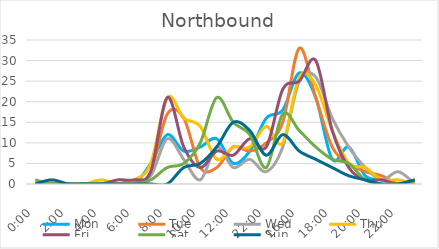
| Category | Mon | Tue | Wed | Thu | Fri | Sat | Sun |
|---|---|---|---|---|---|---|---|
| 0.0 | 0 | 0 | 0 | 0 | 0 | 1 | 0 |
| 0.041667 | 0 | 0 | 0 | 1 | 0 | 0 | 1 |
| 0.083333 | 0 | 0 | 0 | 0 | 0 | 0 | 0 |
| 0.125 | 0 | 0 | 0 | 0 | 0 | 0 | 0 |
| 0.166667 | 0 | 0 | 0 | 1 | 0 | 0 | 0 |
| 0.208333 | 0 | 0 | 0 | 0 | 1 | 0 | 0 |
| 0.25 | 0 | 0 | 1 | 1 | 1 | 0 | 0 |
| 0.291667 | 5 | 3 | 2 | 5 | 3 | 1 | 0 |
| 0.333333 | 12 | 17 | 11 | 21 | 21 | 4 | 0 |
| 0.375 | 8 | 16 | 6 | 16 | 9 | 5 | 4 |
| 0.416667 | 9 | 4 | 1 | 14 | 4 | 10 | 5 |
| 0.458333 | 11 | 4 | 9 | 6 | 8 | 21 | 9 |
| 0.5 | 5 | 9 | 4 | 9 | 7 | 15 | 15 |
| 0.541667 | 8 | 8 | 6 | 9 | 11 | 12 | 13 |
| 1900-01-02 22:00:00 | 16 | 10 | 3 | 14 | 9 | 4 | 7 |
| 0.625 | 18 | 15 | 9 | 10 | 23 | 17 | 12 |
| 0.666667 | 27 | 33 | 25 | 26 | 25 | 13 | 8 |
| 0.708333 | 21 | 21 | 26 | 24 | 30 | 9 | 6 |
| 0.75 | 6 | 9 | 16 | 13 | 13 | 6 | 4 |
| 0.791667 | 9 | 5 | 9 | 5 | 4 | 5 | 2 |
| 0.833333 | 2 | 3 | 4 | 4 | 1 | 1 | 1 |
| 0.875 | 1 | 2 | 1 | 1 | 1 | 0 | 0 |
| 0.916667 | 0 | 0 | 3 | 1 | 0 | 0 | 0 |
| 0.958333 | 0 | 0 | 0 | 0 | 1 | 0 | 1 |